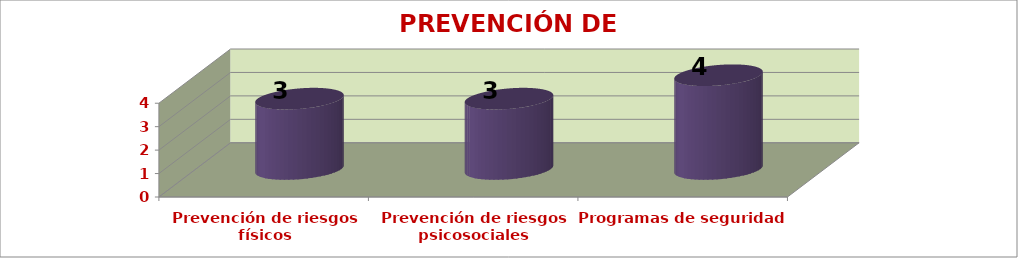
| Category | PREVENCIÓN DE RIESGOS |
|---|---|
| Prevención de riesgos físicos | 3 |
| Prevención de riesgos
psicosociales | 3 |
| Programas de seguridad | 4 |